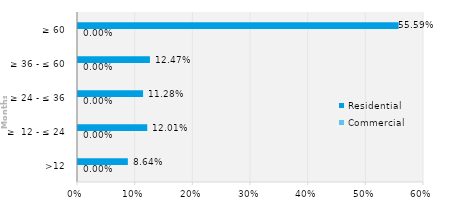
| Category | Commercial | Residential |
|---|---|---|
| >12 | 0 | 0.086 |
| ≥  12 - ≤ 24 | 0 | 0.12 |
| ≥ 24 - ≤ 36 | 0 | 0.113 |
| ≥ 36 - ≤ 60 | 0 | 0.125 |
| ≥ 60 | 0 | 0.556 |